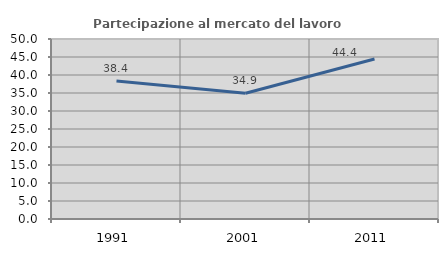
| Category | Partecipazione al mercato del lavoro  femminile |
|---|---|
| 1991.0 | 38.356 |
| 2001.0 | 34.921 |
| 2011.0 | 44.444 |